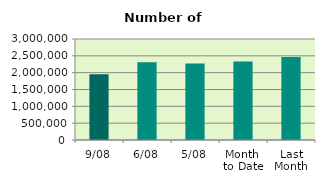
| Category | Series 0 |
|---|---|
| 9/08 | 1951372 |
| 6/08 | 2307530 |
| 5/08 | 2275016 |
| Month 
to Date | 2330226.333 |
| Last
Month | 2465054.636 |